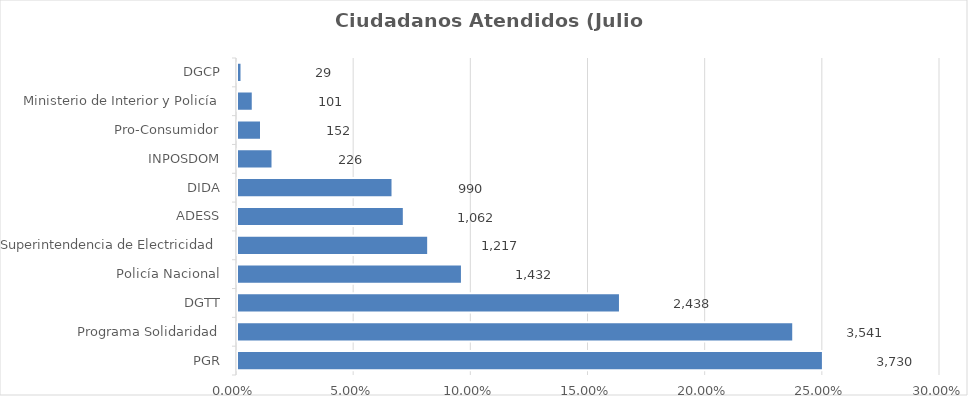
| Category | Porcentaje |
|---|---|
| PGR | 0.25 |
| Programa Solidaridad | 0.237 |
| DGTT | 0.163 |
| Policía Nacional | 0.096 |
| Superintendencia de Electricidad | 0.082 |
| ADESS | 0.071 |
| DIDA | 0.066 |
| INPOSDOM | 0.015 |
| Pro-Consumidor | 0.01 |
| Ministerio de Interior y Policía | 0.007 |
| DGCP | 0.002 |